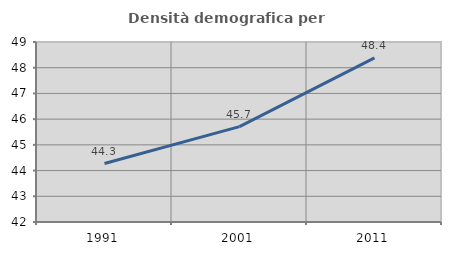
| Category | Densità demografica |
|---|---|
| 1991.0 | 44.274 |
| 2001.0 | 45.708 |
| 2011.0 | 48.383 |